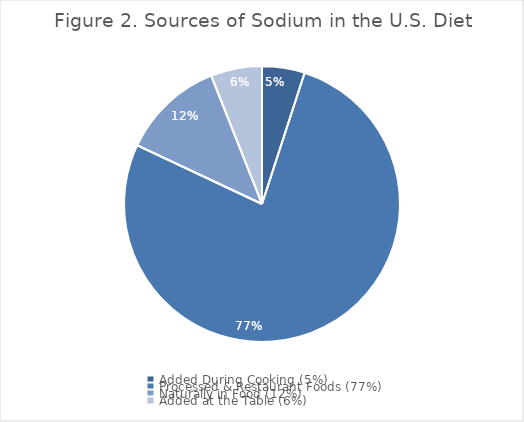
| Category | Figure 2. Sources of Sodium in the U.S. Diet |
|---|---|
| Added During Cooking (5%) | 0.05 |
| Processed & Restaurant Foods (77%) | 0.77 |
| Naturally in Food (12%) | 0.12 |
| Added at the Table (6%) | 0.06 |